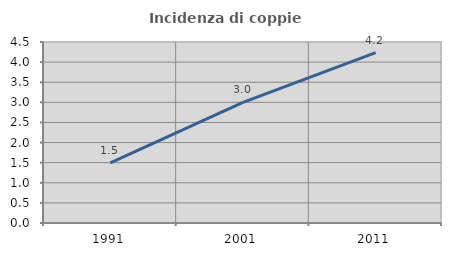
| Category | Incidenza di coppie miste |
|---|---|
| 1991.0 | 1.494 |
| 2001.0 | 3 |
| 2011.0 | 4.236 |